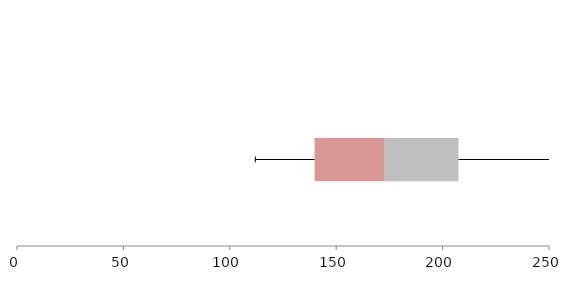
| Category | Series 1 | Series 2 | Series 3 |
|---|---|---|---|
| 0 | 139.839 | 32.642 | 35.003 |